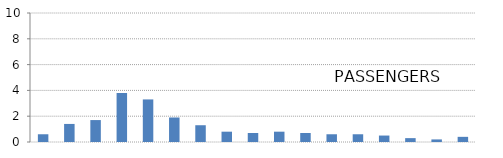
| Category | PASSENGERS |
|---|---|
| 0-4  | 0.6 |
| 5-9 | 1.4 |
| 10-14 | 1.7 |
| 15-19  | 3.8 |
| 20-24  | 3.3 |
| 25-29  | 1.9 |
| 30-34  | 1.3 |
| 35-39  | 0.8 |
| 40-44  | 0.7 |
| 45-49  | 0.8 |
| 50-54  | 0.7 |
| 55-59  | 0.6 |
| 60-64  | 0.6 |
| 65-69  | 0.5 |
| 70-74  | 0.3 |
| 75-79  | 0.2 |
| 80+ | 0.4 |